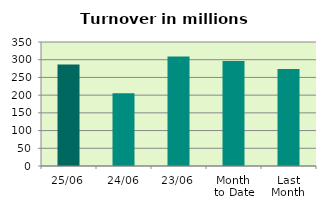
| Category | Series 0 |
|---|---|
| 25/06 | 286.706 |
| 24/06 | 205.127 |
| 23/06 | 308.985 |
| Month 
to Date | 296.595 |
| Last
Month | 273.813 |